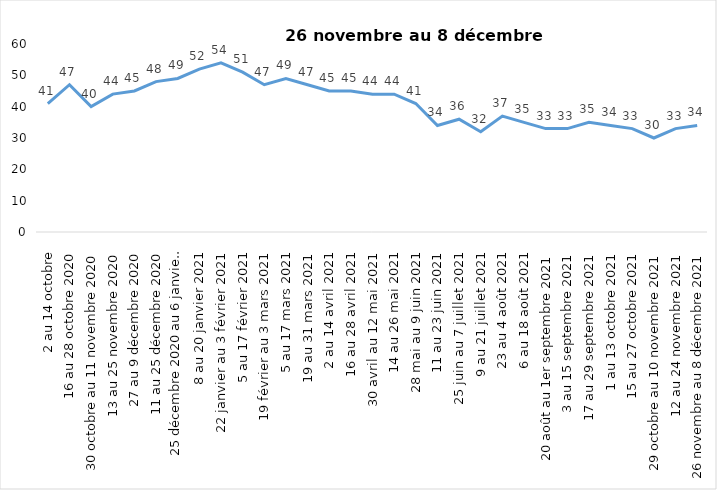
| Category | Toujours aux trois mesures |
|---|---|
| 2 au 14 octobre | 41 |
| 16 au 28 octobre 2020 | 47 |
| 30 octobre au 11 novembre 2020 | 40 |
| 13 au 25 novembre 2020 | 44 |
| 27 au 9 décembre 2020 | 45 |
| 11 au 25 décembre 2020 | 48 |
| 25 décembre 2020 au 6 janvier 2021 | 49 |
| 8 au 20 janvier 2021 | 52 |
| 22 janvier au 3 février 2021 | 54 |
| 5 au 17 février 2021 | 51 |
| 19 février au 3 mars 2021 | 47 |
| 5 au 17 mars 2021 | 49 |
| 19 au 31 mars 2021 | 47 |
| 2 au 14 avril 2021 | 45 |
| 16 au 28 avril 2021 | 45 |
| 30 avril au 12 mai 2021 | 44 |
| 14 au 26 mai 2021 | 44 |
| 28 mai au 9 juin 2021 | 41 |
| 11 au 23 juin 2021 | 34 |
| 25 juin au 7 juillet 2021 | 36 |
| 9 au 21 juillet 2021 | 32 |
| 23 au 4 août 2021 | 37 |
| 6 au 18 août 2021 | 35 |
| 20 août au 1er septembre 2021 | 33 |
| 3 au 15 septembre 2021 | 33 |
| 17 au 29 septembre 2021 | 35 |
| 1 au 13 octobre 2021 | 34 |
| 15 au 27 octobre 2021 | 33 |
| 29 octobre au 10 novembre 2021 | 30 |
| 12 au 24 novembre 2021 | 33 |
| 26 novembre au 8 décembre 2021 | 34 |